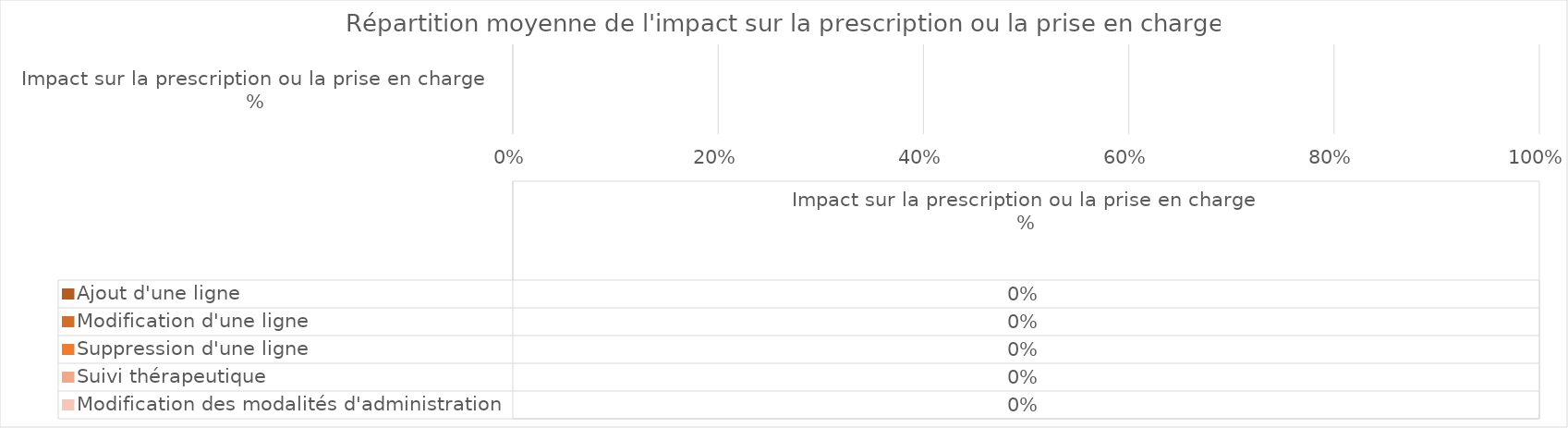
| Category | Ajout d'une ligne | Modification d'une ligne | Suppression d'une ligne | Suivi thérapeutique | Modification des modalités d'administration |
|---|---|---|---|---|---|
| Impact sur la prescription ou la prise en charge
% | 0 | 0 | 0 | 0 | 0 |